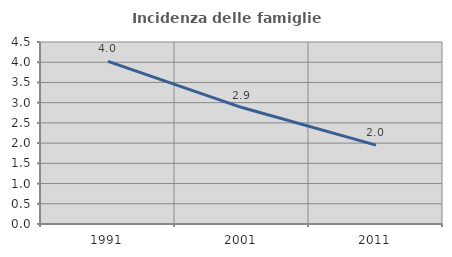
| Category | Incidenza delle famiglie numerose |
|---|---|
| 1991.0 | 4.021 |
| 2001.0 | 2.879 |
| 2011.0 | 1.951 |